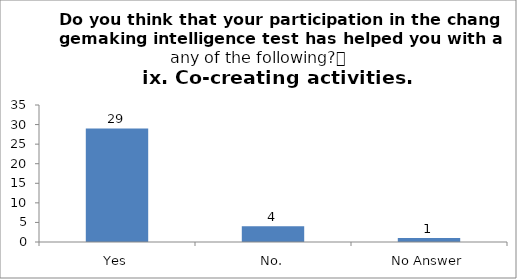
| Category | Do you think that your participation in the changemaking intelligence test has helped you with any of the following?
ix. Co-creating activities. |
|---|---|
| Yes | 29 |
| No. | 4 |
| No Answer | 1 |